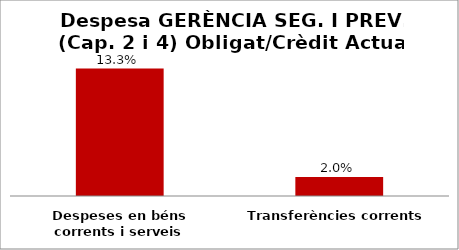
| Category | Series 0 |
|---|---|
| Despeses en béns corrents i serveis | 0.133 |
| Transferències corrents | 0.02 |